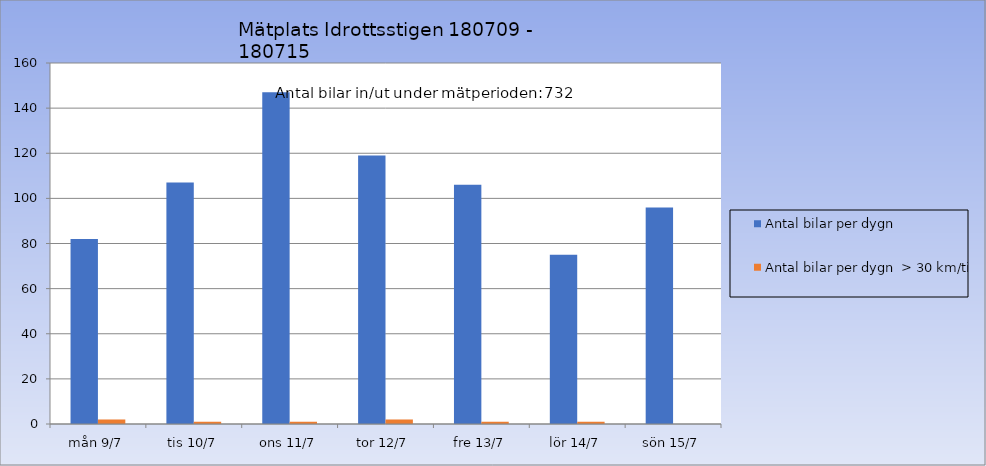
| Category | Antal bilar per dygn | Antal bilar per dygn  > 30 km/tim |
|---|---|---|
| mån 9/7 | 82 | 2 |
| tis 10/7 | 107 | 1 |
| ons 11/7 | 147 | 1 |
| tor 12/7 | 119 | 2 |
| fre 13/7 | 106 | 1 |
| lör 14/7 | 75 | 1 |
| sön 15/7 | 96 | 0 |